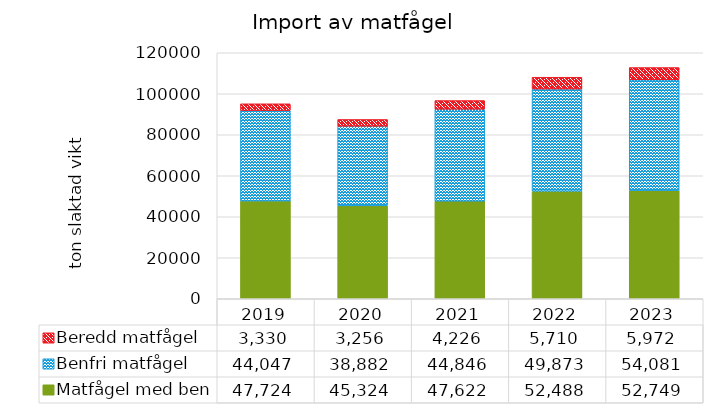
| Category | Matfågel med ben | Benfri matfågel | Beredd matfågel |
|---|---|---|---|
| 2019 | 47724 | 44046.65 | 3329.76 |
| 2020 | 45324 | 38881.75 | 3255.75 |
| 2021 | 47622 | 44845.6 | 4225.89 |
| 2022 | 52488 | 49872.75 | 5709.57 |
| 2023 | 52749 | 54080.65 | 5972.34 |